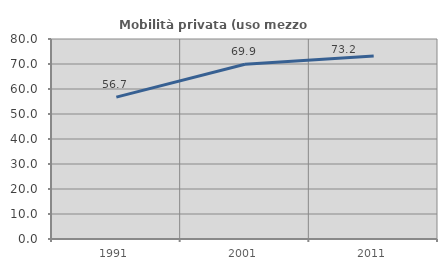
| Category | Mobilità privata (uso mezzo privato) |
|---|---|
| 1991.0 | 56.739 |
| 2001.0 | 69.927 |
| 2011.0 | 73.165 |